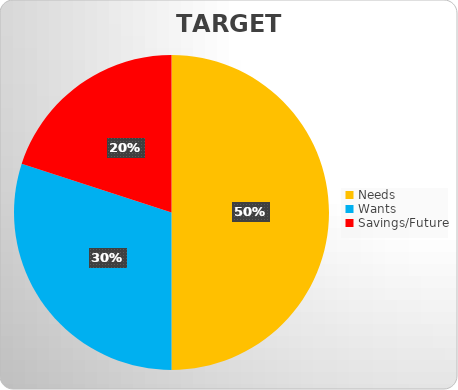
| Category | Series 0 |
|---|---|
| Needs | 50 |
| Wants | 30 |
| Savings/Future | 20 |